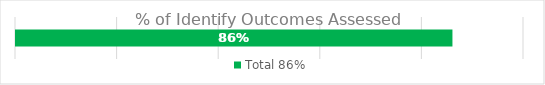
| Category | Total |
|---|---|
| 0 | 0.861 |